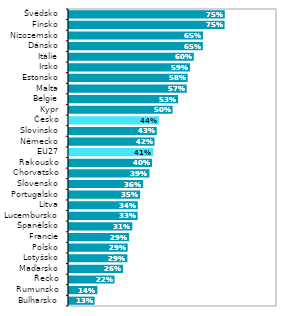
| Category | Series 0 |
|---|---|
| Bulharsko | 0.128 |
| Rumunsko | 0.141 |
| Řecko | 0.224 |
| Maďarsko | 0.264 |
| Lotyšsko | 0.285 |
| Polsko | 0.287 |
| Francie | 0.294 |
| Španělsko | 0.309 |
| Lucembursko | 0.335 |
| Litva | 0.336 |
| Portugalsko | 0.347 |
| Slovensko | 0.361 |
| Chorvatsko | 0.392 |
| Rakousko | 0.404 |
| EU27 | 0.41 |
| Německo | 0.416 |
| Slovinsko | 0.427 |
| Česko | 0.438 |
| Kypr | 0.503 |
| Belgie | 0.53 |
| Malta | 0.571 |
| Estonsko | 0.575 |
| Irsko | 0.587 |
| Itálie | 0.605 |
| Dánsko | 0.648 |
| Nizozemsko | 0.649 |
| Finsko | 0.753 |
| Švédsko | 0.754 |